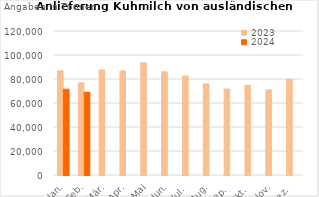
| Category | 2023 | 2024 |
|---|---|---|
| Jan. | 86873.199 | 71508.229 |
| Feb. | 76778.085 | 69008.515 |
| Mär. | 87564.068 | 0 |
| Apr. | 86747.855 | 0 |
| Mai | 93469.071 | 0 |
| Jun. | 86016.792 | 0 |
| Jul. | 82462.839 | 0 |
| Aug. | 75905.162 | 0 |
| Sep. | 71675.928 | 0 |
| Okt. | 74661.604 | 0 |
| Nov. | 70996.025 | 0 |
| Dez. | 79661.542 | 0 |